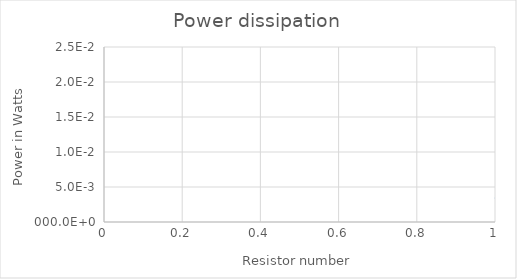
| Category | Series 0 |
|---|---|
| 0 | 0.003 |
| 1 | 0.023 |
| 2 | 0.012 |
| 3 | 0.006 |
| 4 | 0.003 |
| 5 | 0.001 |
| 6 | 0.001 |